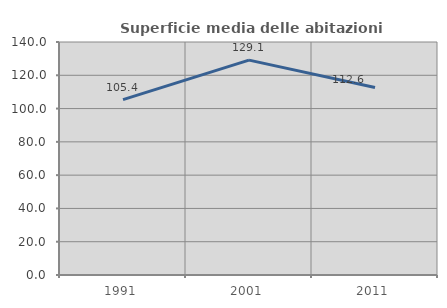
| Category | Superficie media delle abitazioni occupate |
|---|---|
| 1991.0 | 105.351 |
| 2001.0 | 129.108 |
| 2011.0 | 112.624 |